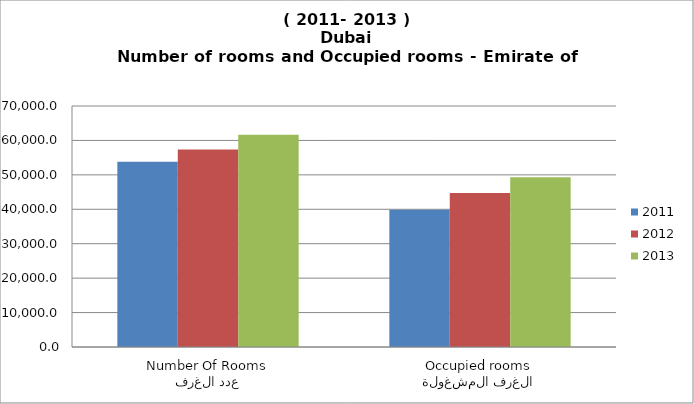
| Category | 2011 | 2012 | 2013 |
|---|---|---|---|
| عدد الغرف
Number Of Rooms | 53828 | 57345 | 61670 |
| الغرف المشغولة
Occupied rooms | 39833 | 44729.1 | 49336 |